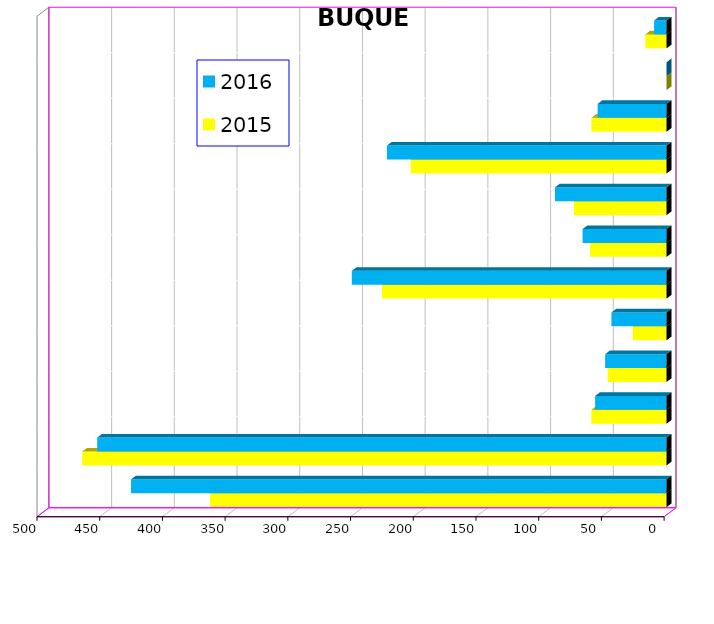
| Category | 2015 | 2016 |
|---|---|---|
| ICAVE | 364 | 427 |
| CICE | 466 | 454 |
| T. C. E. | 60 | 57 |
| CARGILL | 47 | 49 |
| TMV | 27 | 44 |
| SSA | 227 | 251 |
| SEPSA | 61 | 67 |
| VOPAK | 74 | 89 |
| CPV | 204 | 223 |
| EXCELLENCE | 60 | 55 |
| APASCO | 0 | 0 |
| SIP | 17 | 10 |